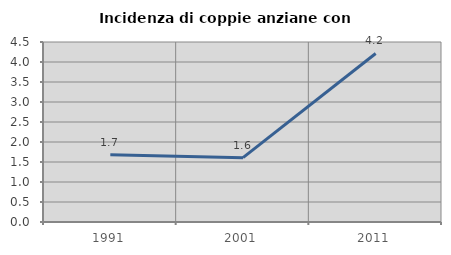
| Category | Incidenza di coppie anziane con figli |
|---|---|
| 1991.0 | 1.681 |
| 2001.0 | 1.609 |
| 2011.0 | 4.213 |